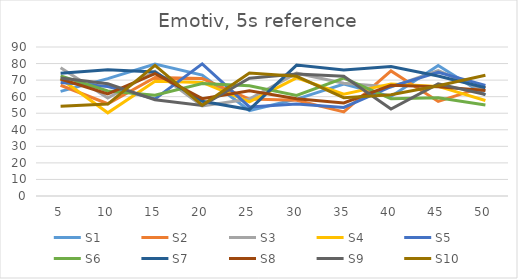
| Category | S1 | S2 | S3 | S4 | S5 | S6 | S7 | S8 | S9 | S10 |
|---|---|---|---|---|---|---|---|---|---|---|
| 5.0 | 63.2 | 66.9 | 77.42 | 70.82 | 68.55 | 72.57 | 74.17 | 70.68 | 71.3 | 54.27 |
| 10.0 | 70.87 | 55.72 | 59.19 | 50.25 | 66.15 | 63.47 | 76.29 | 61.69 | 67.76 | 55.5 |
| 15.0 | 79.67 | 71.57 | 75.32 | 69.25 | 58.68 | 60.84 | 74.94 | 73.89 | 58.12 | 78.86 |
| 20.0 | 73.04 | 70.92 | 54.34 | 68.6 | 79.79 | 67.95 | 57.22 | 58.79 | 54.63 | 54.86 |
| 25.0 | 51.64 | 58.52 | 58.62 | 56.91 | 53.82 | 66.56 | 52.19 | 63.57 | 71.1 | 74.27 |
| 30.0 | 58.5 | 57.88 | 74.19 | 71.38 | 55.52 | 60.7 | 79.06 | 58.75 | 73.7 | 72.32 |
| 35.0 | 67.62 | 50.81 | 68.05 | 61.45 | 53.52 | 71.2 | 76.08 | 56.19 | 72.35 | 59.41 |
| 40.0 | 60.16 | 75.58 | 65.81 | 67.72 | 66.05 | 58.77 | 78.23 | 66.83 | 52.5 | 61.11 |
| 45.0 | 78.8 | 57.11 | 75.69 | 66.19 | 74.78 | 59.41 | 72.5 | 65.94 | 67.72 | 66.57 |
| 50.0 | 61.02 | 66.18 | 63.53 | 57.7 | 66.79 | 55 | 65.39 | 63.66 | 61.34 | 72.91 |